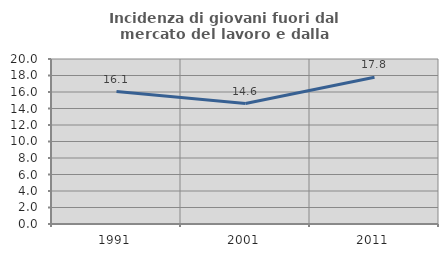
| Category | Incidenza di giovani fuori dal mercato del lavoro e dalla formazione  |
|---|---|
| 1991.0 | 16.056 |
| 2001.0 | 14.602 |
| 2011.0 | 17.778 |